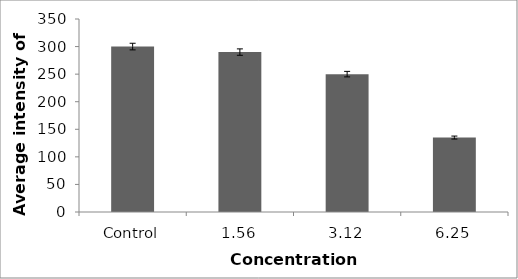
| Category | Series 0 |
|---|---|
| Control | 300 |
| 1.56 | 290 |
| 3.12 | 250 |
| 6.25 | 135 |